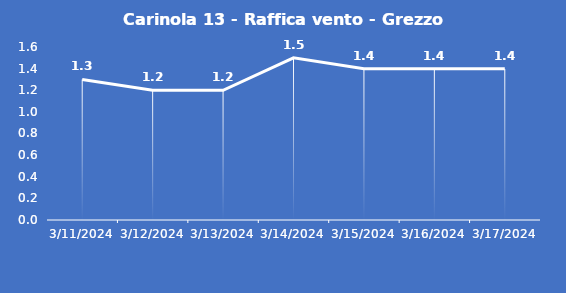
| Category | Carinola 13 - Raffica vento - Grezzo (m/s) |
|---|---|
| 3/11/24 | 1.3 |
| 3/12/24 | 1.2 |
| 3/13/24 | 1.2 |
| 3/14/24 | 1.5 |
| 3/15/24 | 1.4 |
| 3/16/24 | 1.4 |
| 3/17/24 | 1.4 |